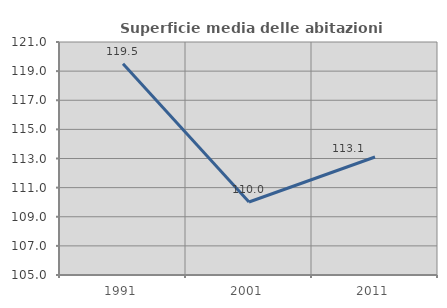
| Category | Superficie media delle abitazioni occupate |
|---|---|
| 1991.0 | 119.503 |
| 2001.0 | 110.015 |
| 2011.0 | 113.105 |